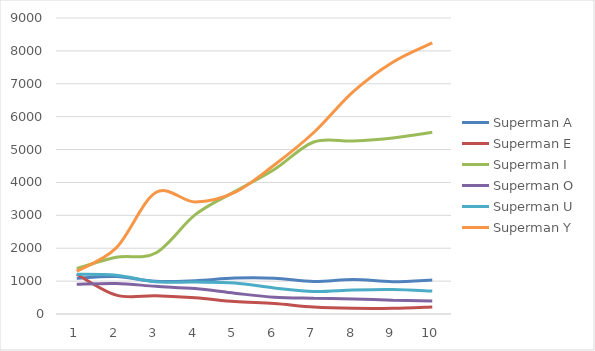
| Category | Superman |
|---|---|
| 1.0 | 1302 |
| 2.0 | 2011 |
| 3.0 | 3693 |
| 4.0 | 3405 |
| 5.0 | 3695 |
| 6.0 | 4530 |
| 7.0 | 5519 |
| 8.0 | 6764 |
| 9.0 | 7657 |
| 10.0 | 8242 |